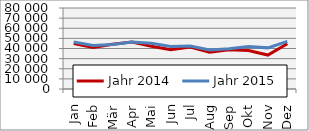
| Category | Jahr 2014 | Jahr 2015 |
|---|---|---|
| Jan | 44967.454 | 46393.481 |
| Feb | 40988.12 | 43067.823 |
| Mär | 44120.8 | 43874.333 |
| Apr | 46401.621 | 46377.317 |
| Mai | 42169.599 | 45151.819 |
| Jun | 38669.005 | 41964.581 |
| Jul | 41368.369 | 42544.302 |
| Aug | 36388.552 | 38497.012 |
| Sep | 38758.828 | 39766.763 |
| Okt | 38081.94 | 42013.825 |
| Nov | 33532.021 | 40625.033 |
| Dez | 44733.422 | 46978.685 |